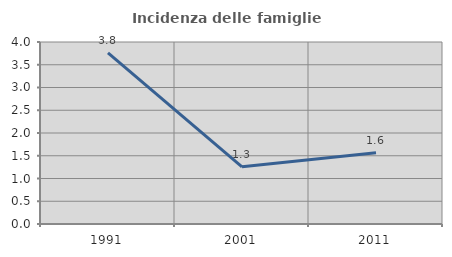
| Category | Incidenza delle famiglie numerose |
|---|---|
| 1991.0 | 3.762 |
| 2001.0 | 1.257 |
| 2011.0 | 1.567 |